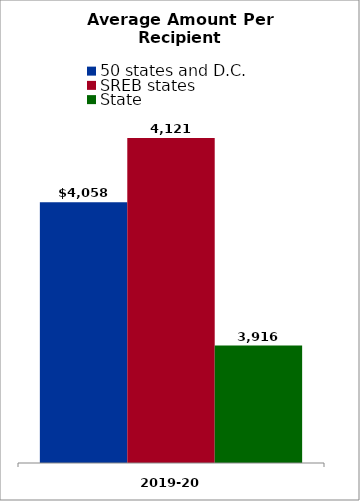
| Category | 50 states and D.C. | SREB states | State |
|---|---|---|---|
| 2019-20 | 4057.822 | 4121.351 | 3916.147 |